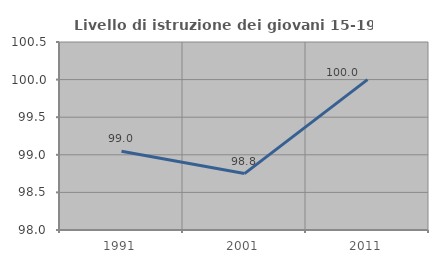
| Category | Livello di istruzione dei giovani 15-19 anni |
|---|---|
| 1991.0 | 99.048 |
| 2001.0 | 98.75 |
| 2011.0 | 100 |